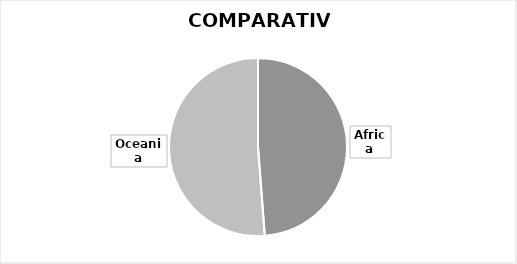
| Category | FEV |
|---|---|
| Africa | 100 |
| Oceania | 105 |